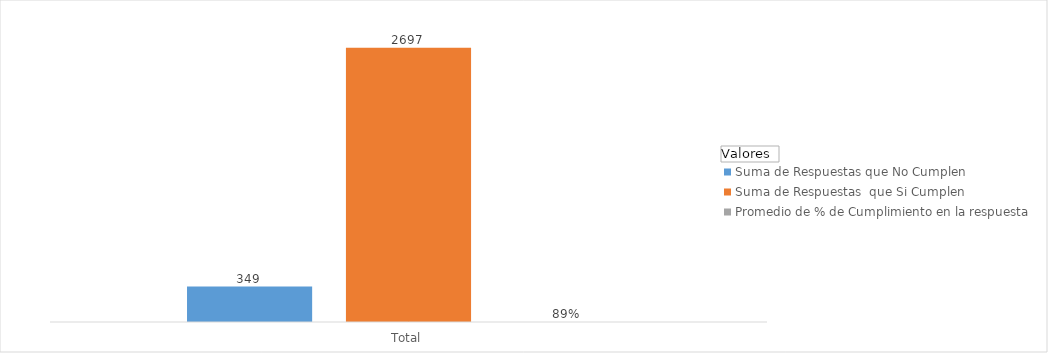
| Category | Suma de Respuestas que No Cumplen  | Suma de Respuestas  que Si Cumplen | Promedio de % de Cumplimiento en la respuesta |
|---|---|---|---|
| Total | 349 | 2697 | 0.885 |